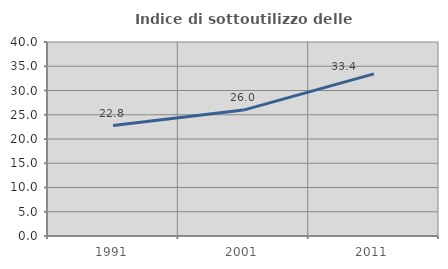
| Category | Indice di sottoutilizzo delle abitazioni  |
|---|---|
| 1991.0 | 22.782 |
| 2001.0 | 25.959 |
| 2011.0 | 33.426 |